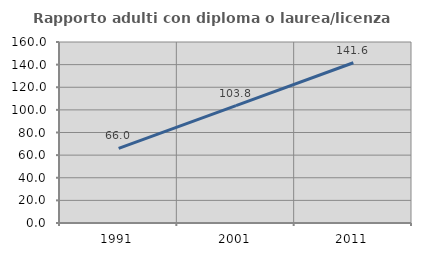
| Category | Rapporto adulti con diploma o laurea/licenza media  |
|---|---|
| 1991.0 | 65.951 |
| 2001.0 | 103.829 |
| 2011.0 | 141.649 |